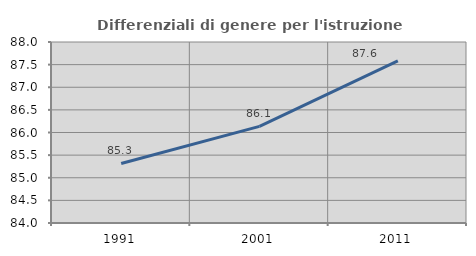
| Category | Differenziali di genere per l'istruzione superiore |
|---|---|
| 1991.0 | 85.316 |
| 2001.0 | 86.134 |
| 2011.0 | 87.585 |